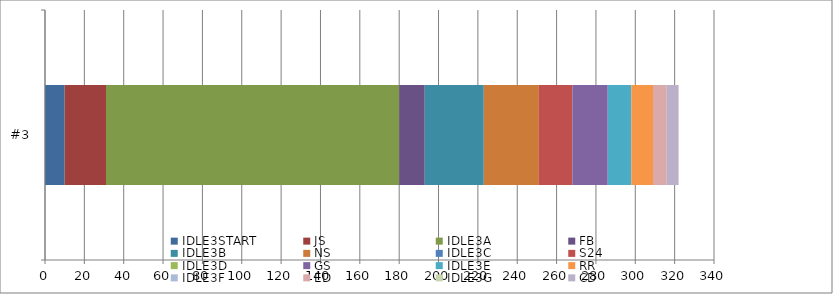
| Category | IDLE3START | JS | IDLE3A | FB | IDLE3B | NS | IDLE3C | S24 | IDLE3D | GS | IDLE3E | RR | IDLE3F | ED | IDLE3G | CD |
|---|---|---|---|---|---|---|---|---|---|---|---|---|---|---|---|---|
| #3 | 10 | 21 | 149 | 13 | 30 | 28 | 0 | 17 | 0 | 18 | 12 | 11 | 0 | 7 | 0 | 6 |